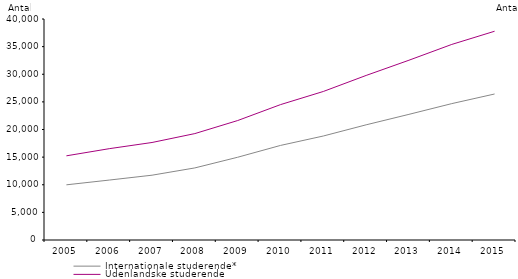
| Category | Internationale studerende* | Udenlandske studerende |
|---|---|---|
| 2005.0 | 9988 | 15235 |
| 2006.0 | 10848 | 16528 |
| 2007.0 | 11728 | 17648 |
| 2008.0 | 13046 | 19261 |
| 2009.0 | 14980 | 21622 |
| 2010.0 | 17116 | 24504 |
| 2011.0 | 18822 | 26883 |
| 2012.0 | 20846 | 29785 |
| 2013.0 | 22742 | 32537 |
| 2014.0 | 24686 | 35396 |
| 2015.0 | 26426 | 37784 |